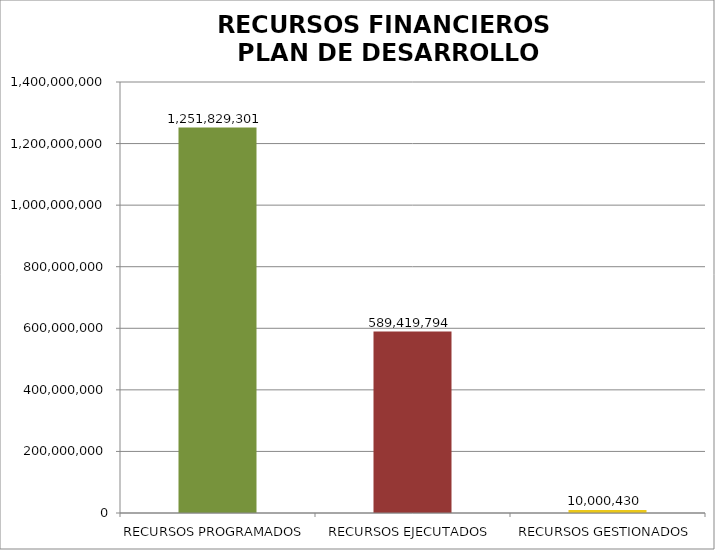
| Category | Series 0 |
|---|---|
| RECURSOS PROGRAMADOS | 1251829301.032 |
| RECURSOS EJECUTADOS | 589419794.349 |
| RECURSOS GESTIONADOS | 10000430 |